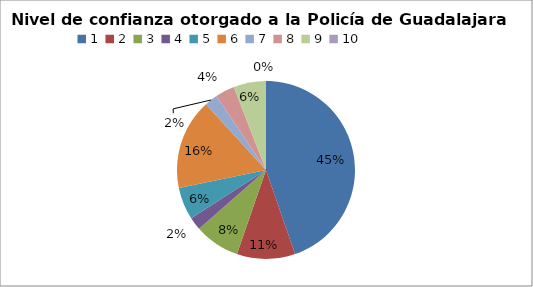
| Category | Series 0 |
|---|---|
| 0 | 0.447 |
| 1 | 0.106 |
| 2 | 0.082 |
| 3 | 0.024 |
| 4 | 0.059 |
| 5 | 0.165 |
| 6 | 0.024 |
| 7 | 0.035 |
| 8 | 0.059 |
| 9 | 0 |